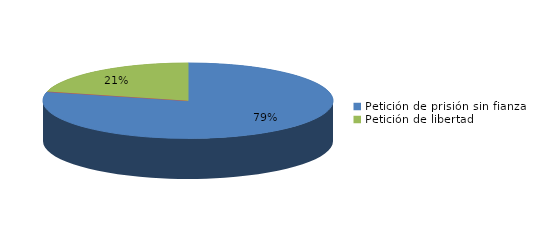
| Category | Series 0 |
|---|---|
| Petición de prisión sin fianza | 71 |
| Peticion de libertad con fianza | 0 |
| Petición de libertad | 19 |